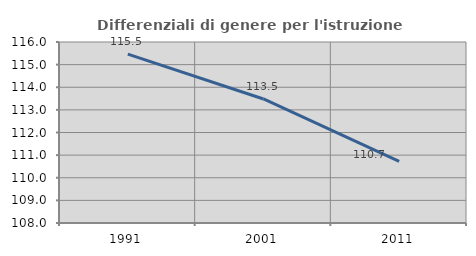
| Category | Differenziali di genere per l'istruzione superiore |
|---|---|
| 1991.0 | 115.464 |
| 2001.0 | 113.483 |
| 2011.0 | 110.725 |